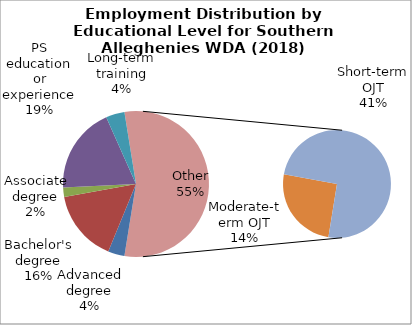
| Category | Series 0 |
|---|---|
| Advanced degree | 6830 |
| Bachelor's degree | 29730 |
| Associate degree | 3870 |
| PS education or experience | 35610 |
| Long-term training | 7720 |
| Moderate-term OJT | 26070 |
| Short-term OJT | 76670 |